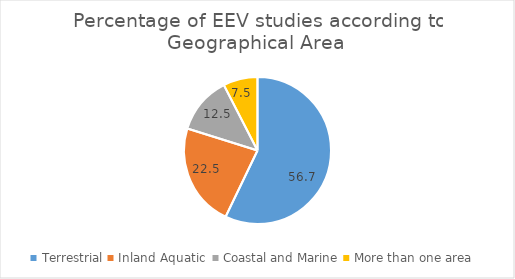
| Category | Percentage  |
|---|---|
| Terrestrial | 56.667 |
| Inland Aquatic  | 22.5 |
| Coastal and Marine | 12.5 |
| More than one area | 7.5 |